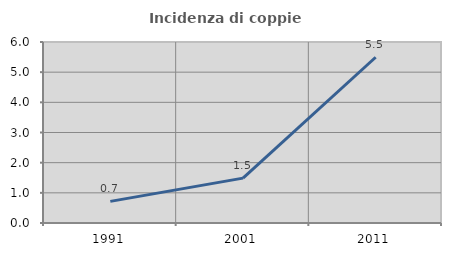
| Category | Incidenza di coppie miste |
|---|---|
| 1991.0 | 0.717 |
| 2001.0 | 1.487 |
| 2011.0 | 5.495 |